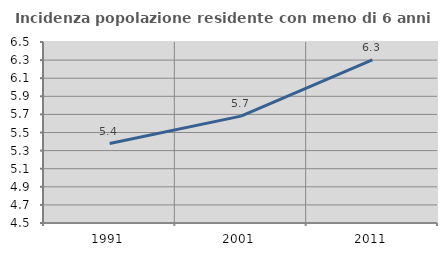
| Category | Incidenza popolazione residente con meno di 6 anni |
|---|---|
| 1991.0 | 5.378 |
| 2001.0 | 5.681 |
| 2011.0 | 6.303 |